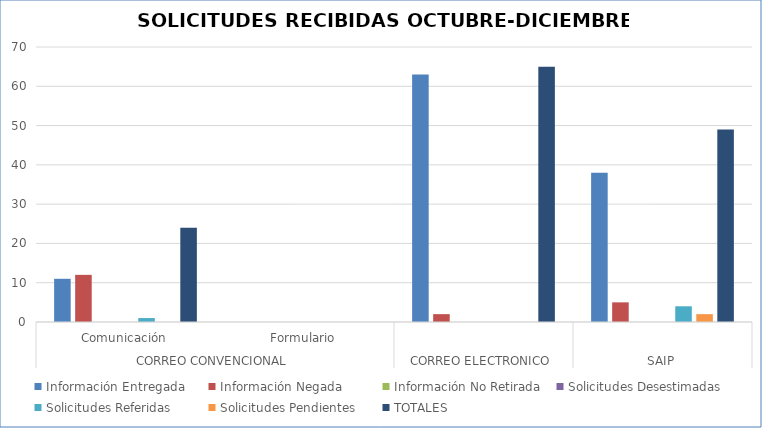
| Category | Información Entregada | Información Negada | Información No Retirada | Solicitudes Desestimadas | Solicitudes Referidas | Solicitudes Pendientes | TOTALES |
|---|---|---|---|---|---|---|---|
| 0 | 11 | 12 | 0 | 0 | 1 | 0 | 24 |
| 1 | 0 | 0 | 0 | 0 | 0 | 0 | 0 |
| 2 | 63 | 2 | 0 | 0 | 0 | 0 | 65 |
| 3 | 38 | 5 | 0 | 0 | 4 | 2 | 49 |